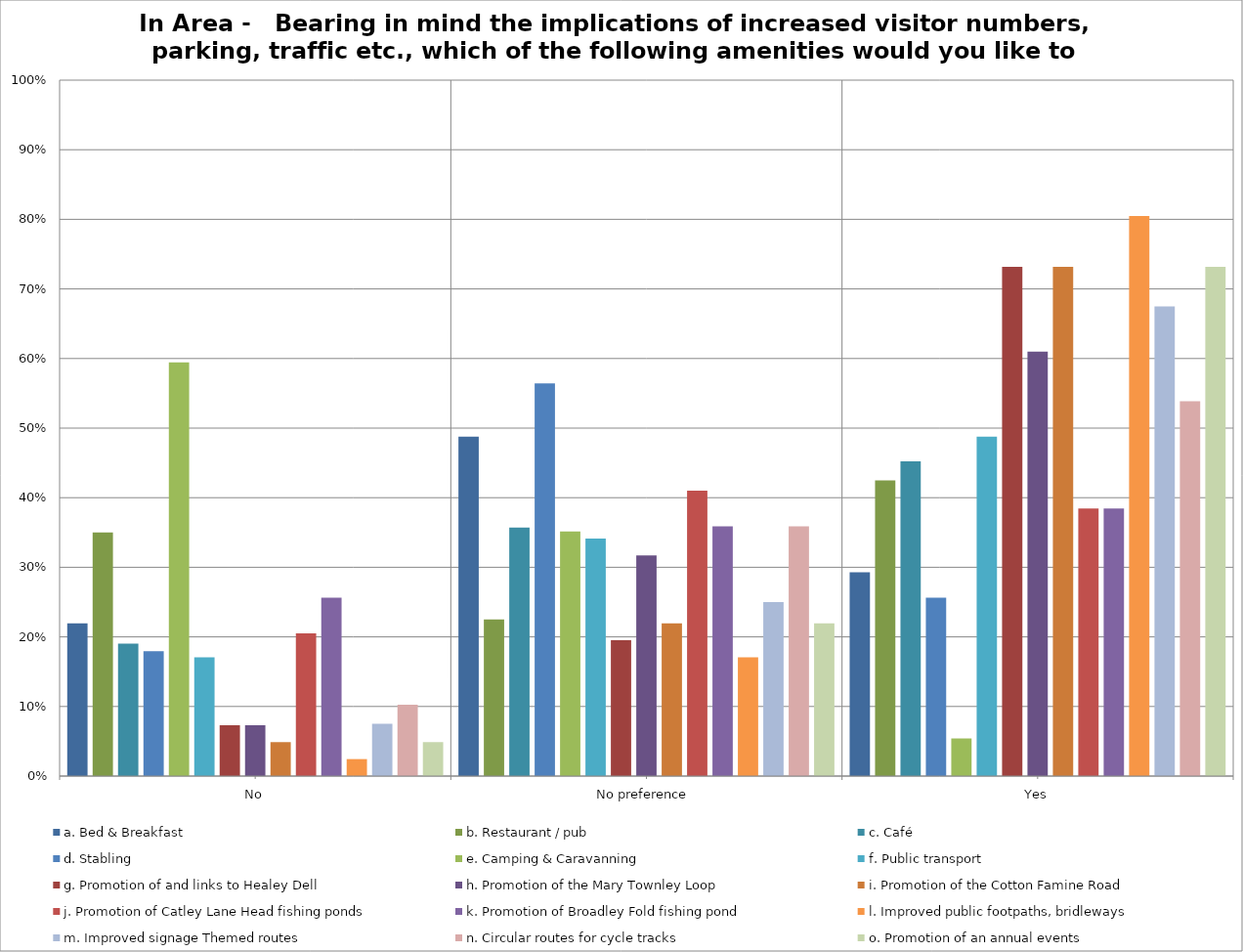
| Category | a. Bed & Breakfast | b. Restaurant / pub | c. Café | d. Stabling | e. Camping & Caravanning | f. Public transport | g. Promotion of and links to Healey Dell | h. Promotion of the Mary Townley Loop | i. Promotion of the Cotton Famine Road | j. Promotion of Catley Lane Head fishing ponds | k. Promotion of Broadley Fold fishing pond | l. Improved public footpaths, bridleways | m. Improved signage Themed routes | n. Circular routes for cycle tracks | o. Promotion of an annual events |
|---|---|---|---|---|---|---|---|---|---|---|---|---|---|---|---|
| No | 0.22 | 0.35 | 0.19 | 0.179 | 0.595 | 0.171 | 0.073 | 0.073 | 0.049 | 0.205 | 0.256 | 0.024 | 0.075 | 0.103 | 0.049 |
| No preference  | 0.488 | 0.225 | 0.357 | 0.564 | 0.351 | 0.341 | 0.195 | 0.317 | 0.22 | 0.41 | 0.359 | 0.171 | 0.25 | 0.359 | 0.22 |
| Yes | 0.293 | 0.425 | 0.452 | 0.256 | 0.054 | 0.488 | 0.732 | 0.61 | 0.732 | 0.385 | 0.385 | 0.805 | 0.675 | 0.538 | 0.732 |